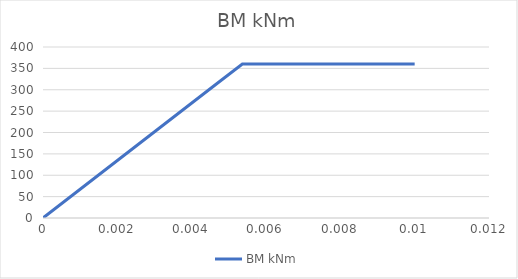
| Category | BM |
|---|---|
| 0.0 | 0 |
| 0.004664634146341462 | 313.363 |
| 0.0053643292682926825 | 360.368 |
| 0.01 | 360.368 |